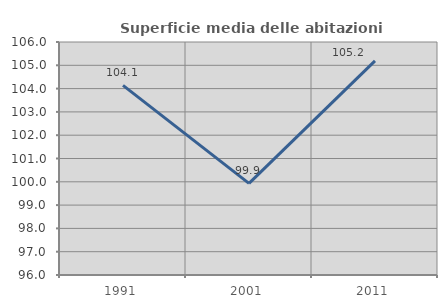
| Category | Superficie media delle abitazioni occupate |
|---|---|
| 1991.0 | 104.137 |
| 2001.0 | 99.932 |
| 2011.0 | 105.193 |